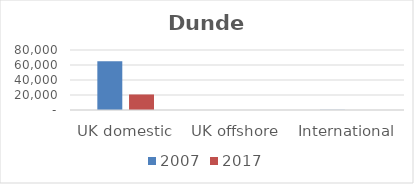
| Category | 2007 | 2017 |
|---|---|---|
| UK domestic | 65105 | 20717 |
| UK offshore | 0 | 0 |
| International | 200 | 0 |